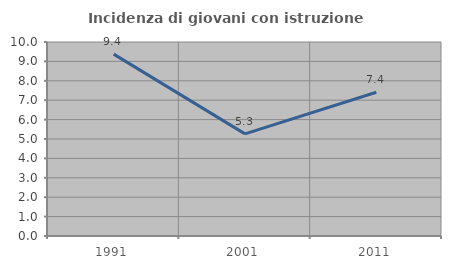
| Category | Incidenza di giovani con istruzione universitaria |
|---|---|
| 1991.0 | 9.375 |
| 2001.0 | 5.263 |
| 2011.0 | 7.407 |